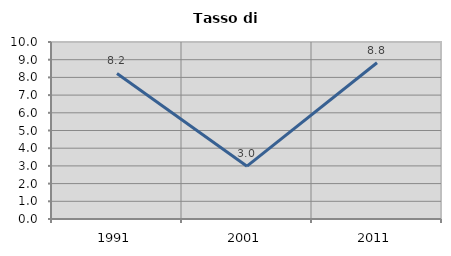
| Category | Tasso di disoccupazione   |
|---|---|
| 1991.0 | 8.222 |
| 2001.0 | 2.985 |
| 2011.0 | 8.828 |